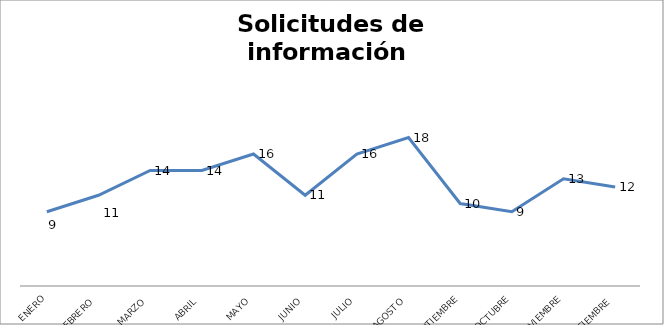
| Category | Series 0 |
|---|---|
| ENERO | 9 |
| FEBRERO | 11 |
| MARZO | 14 |
| ABRIL | 14 |
| MAYO | 16 |
| JUNIO | 11 |
| JULIO | 16 |
| AGOSTO | 18 |
| SEPTIEMBRE | 10 |
| OCTUBRE | 9 |
| NOVIEMBRE | 13 |
| DICIEMBRE | 12 |